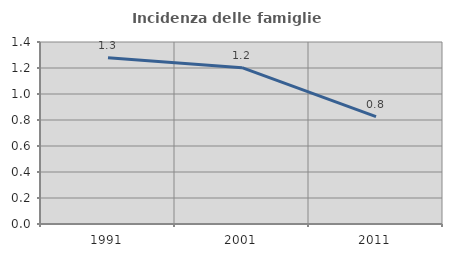
| Category | Incidenza delle famiglie numerose |
|---|---|
| 1991.0 | 1.279 |
| 2001.0 | 1.202 |
| 2011.0 | 0.826 |